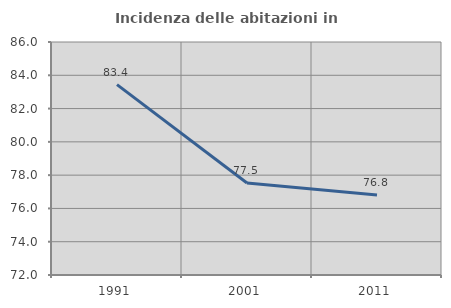
| Category | Incidenza delle abitazioni in proprietà  |
|---|---|
| 1991.0 | 83.436 |
| 2001.0 | 77.529 |
| 2011.0 | 76.803 |